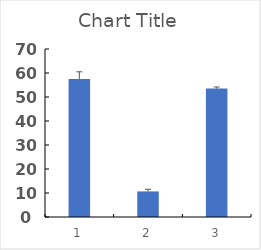
| Category | Series 0 |
|---|---|
| 0 | 57.5 |
| 1 | 10.667 |
| 2 | 53.5 |